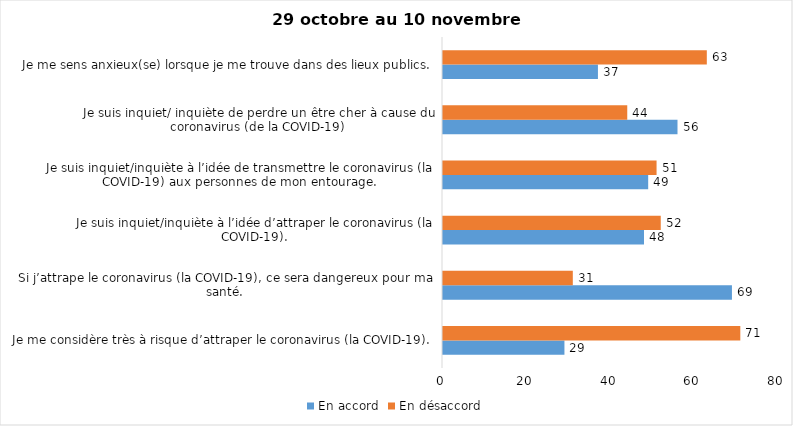
| Category | En accord | En désaccord |
|---|---|---|
| Je me considère très à risque d’attraper le coronavirus (la COVID-19). | 29 | 71 |
| Si j’attrape le coronavirus (la COVID-19), ce sera dangereux pour ma santé. | 69 | 31 |
| Je suis inquiet/inquiète à l’idée d’attraper le coronavirus (la COVID-19). | 48 | 52 |
| Je suis inquiet/inquiète à l’idée de transmettre le coronavirus (la COVID-19) aux personnes de mon entourage. | 49 | 51 |
| Je suis inquiet/ inquiète de perdre un être cher à cause du coronavirus (de la COVID-19) | 56 | 44 |
| Je me sens anxieux(se) lorsque je me trouve dans des lieux publics. | 37 | 63 |